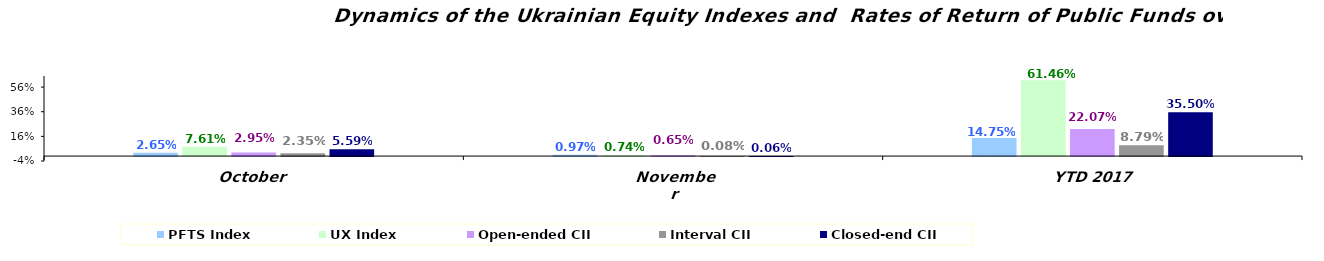
| Category | PFTS Index | UX Index | Open-ended CII | Interval CII | Closed-end CII |
|---|---|---|---|---|---|
| October | 0.027 | 0.076 | 0.029 | 0.024 | 0.056 |
| November | 0.01 | 0.007 | 0.006 | 0.001 | 0.001 |
| YTD 2017 | 0.148 | 0.615 | 0.221 | 0.088 | 0.355 |